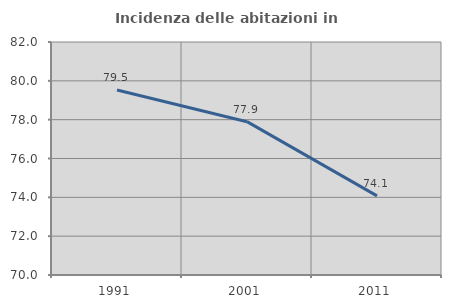
| Category | Incidenza delle abitazioni in proprietà  |
|---|---|
| 1991.0 | 79.528 |
| 2001.0 | 77.897 |
| 2011.0 | 74.074 |